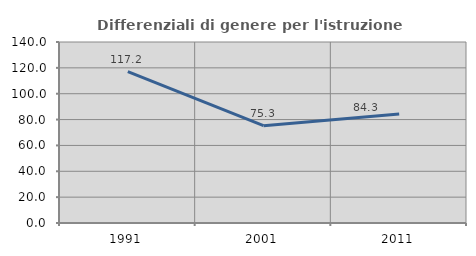
| Category | Differenziali di genere per l'istruzione superiore |
|---|---|
| 1991.0 | 117.152 |
| 2001.0 | 75.3 |
| 2011.0 | 84.302 |